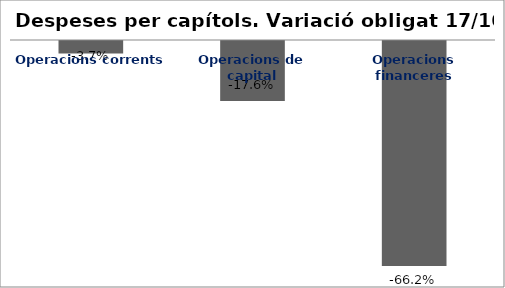
| Category | Series 0 |
|---|---|
| Operacions corrents | -0.037 |
| Operacions de capital | -0.176 |
| Operacions financeres | -0.662 |